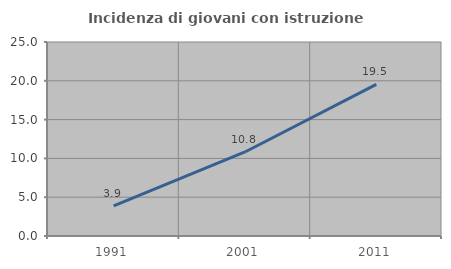
| Category | Incidenza di giovani con istruzione universitaria |
|---|---|
| 1991.0 | 3.877 |
| 2001.0 | 10.83 |
| 2011.0 | 19.535 |